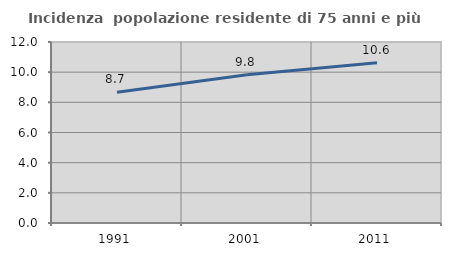
| Category | Incidenza  popolazione residente di 75 anni e più |
|---|---|
| 1991.0 | 8.669 |
| 2001.0 | 9.829 |
| 2011.0 | 10.619 |